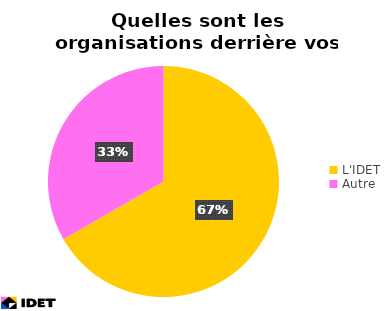
| Category | Series 1 |
|---|---|
| L'IDET | 6 |
| Autre  | 3 |